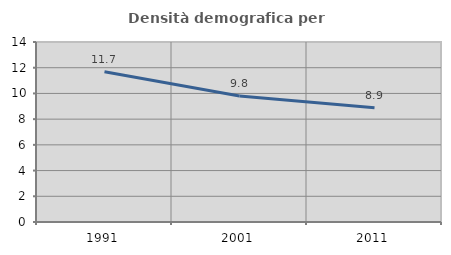
| Category | Densità demografica |
|---|---|
| 1991.0 | 11.687 |
| 2001.0 | 9.807 |
| 2011.0 | 8.892 |